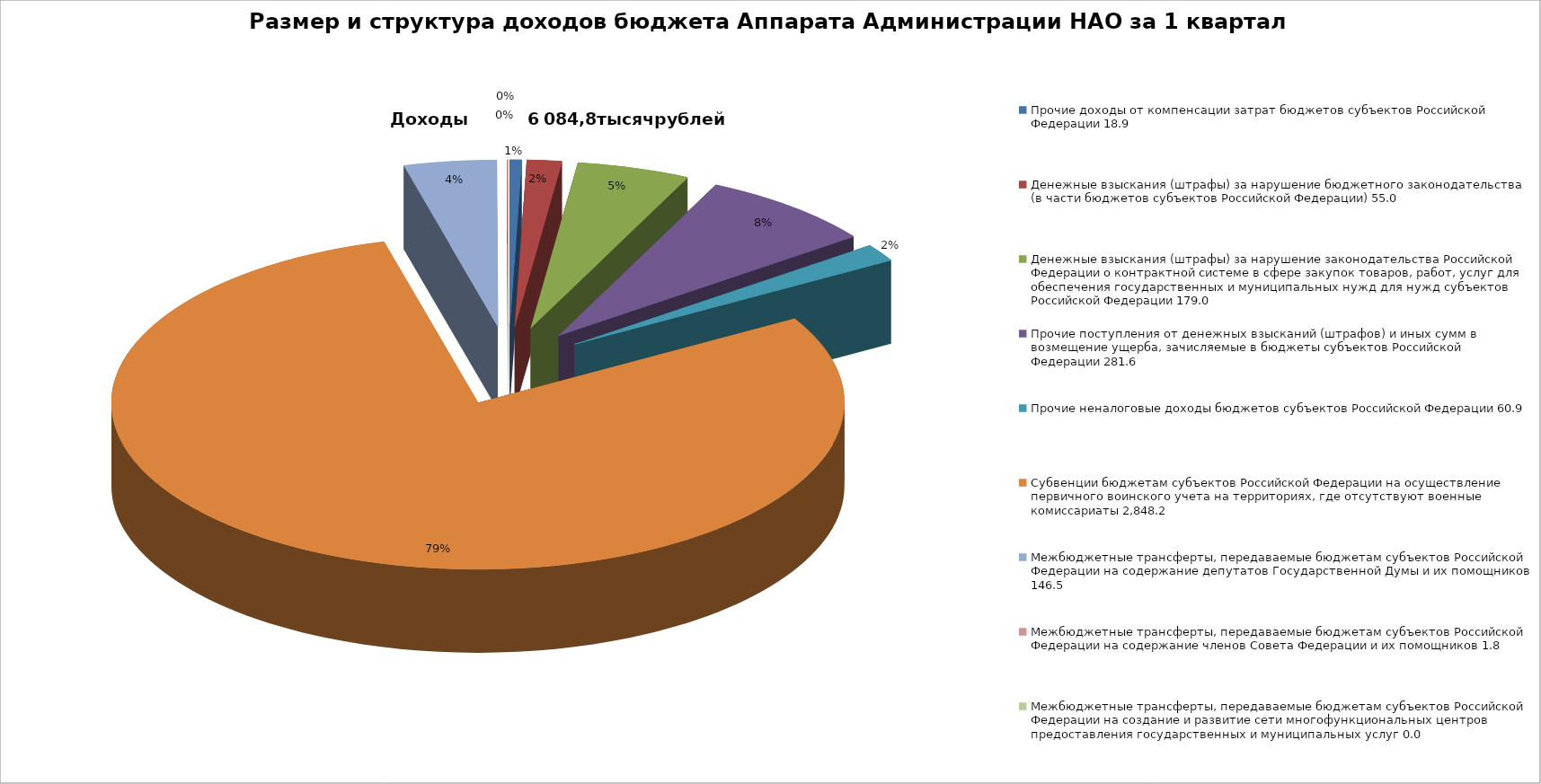
| Category | Размер и структура доходов бюджета Аппарата Администрации НАО за 1 квартал 2016 года |
|---|---|
| 0 | 18.9 |
| 1 | 55 |
| 2 | 179 |
| 3 | 281.6 |
| 4 | 60.9 |
| 5 | 2848.2 |
| 6 | 146.5 |
| 7 | 1.8 |
| 8 | 0 |